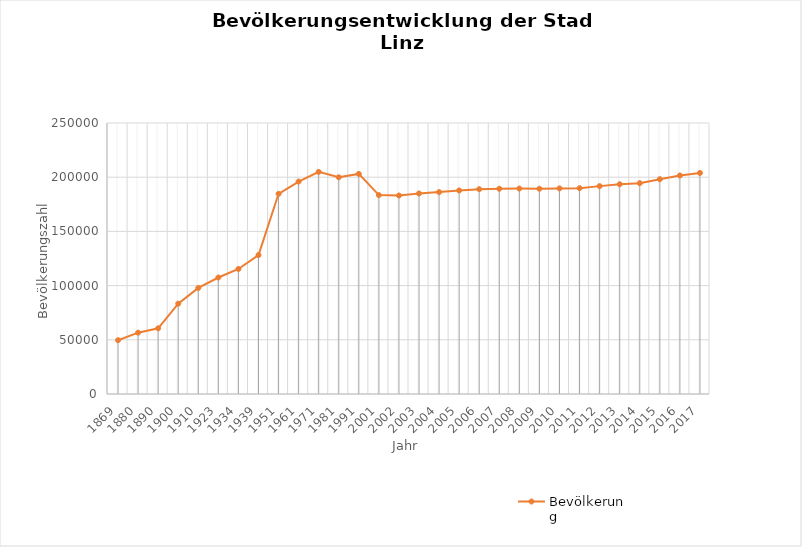
| Category | Bevölkerung |
|---|---|
| 1869.0 | 49635 |
| 1880.0 | 56569 |
| 1890.0 | 60590 |
| 1900.0 | 83356 |
| 1910.0 | 97852 |
| 1923.0 | 107463 |
| 1934.0 | 115338 |
| 1939.0 | 128177 |
| 1951.0 | 184685 |
| 1961.0 | 195978 |
| 1971.0 | 204889 |
| 1981.0 | 199910 |
| 1991.0 | 203044 |
| 2001.0 | 183504 |
| 2002.0 | 183133 |
| 2003.0 | 184995 |
| 2004.0 | 186261 |
| 2005.0 | 187763 |
| 2006.0 | 188968 |
| 2007.0 | 189343 |
| 2008.0 | 189528 |
| 2009.0 | 189355 |
| 2010.0 | 189680 |
| 2011.0 | 189845 |
| 2012.0 | 191767 |
| 2013.0 | 193486 |
| 2014.0 | 194522 |
| 2015.0 | 198181 |
| 2016.0 | 201595 |
| 2017.0 | 203957 |